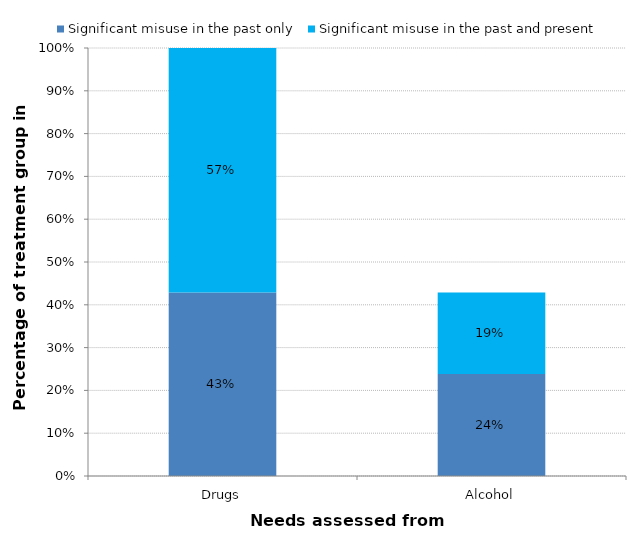
| Category | Significant misuse in the past only | Significant misuse in the past and present |
|---|---|---|
| Drugs | 0.429 | 0.571 |
| Alcohol | 0.238 | 0.19 |